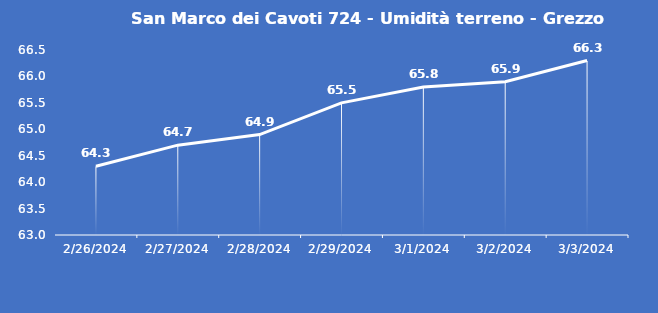
| Category | San Marco dei Cavoti 724 - Umidità terreno - Grezzo (%VWC) |
|---|---|
| 2/26/24 | 64.3 |
| 2/27/24 | 64.7 |
| 2/28/24 | 64.9 |
| 2/29/24 | 65.5 |
| 3/1/24 | 65.8 |
| 3/2/24 | 65.9 |
| 3/3/24 | 66.3 |